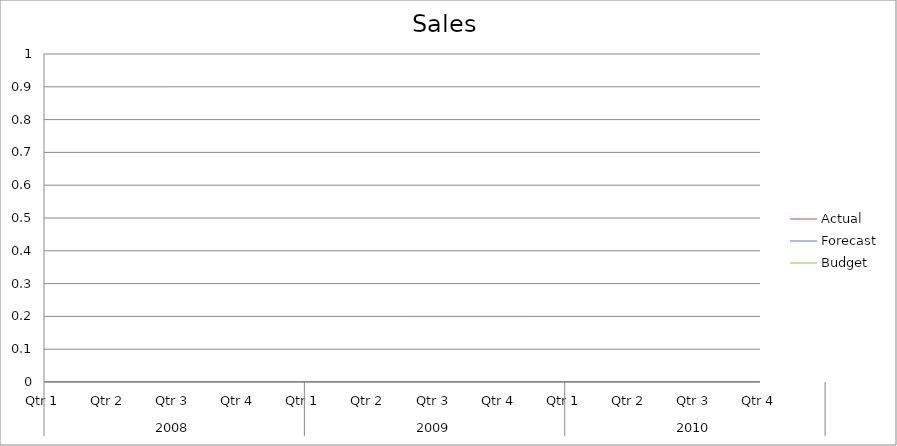
| Category | Budget | Forecast | Actual |
|---|---|---|---|
| 0 | 2010 | 3150 | 3410 |
| 1 | 1140 | 1100 | 1990 |
| 2 | 1230 | 2870 | 1470 |
| 3 | 2620 | 2150 | 1240 |
| 4 | 2990 | 2770 | 3330 |
| 5 | 1200 | 570 | 1700 |
| 6 | 2200 | 1810 | 2690 |
| 7 | 2080 | 1580 | 1470 |
| 8 | 590 | 1810 | 2280 |
| 9 | 1370 | 690 | 2660 |
| 10 | 1170 | 870 | 3010 |
| 11 | 630 | 3000 | 1930 |